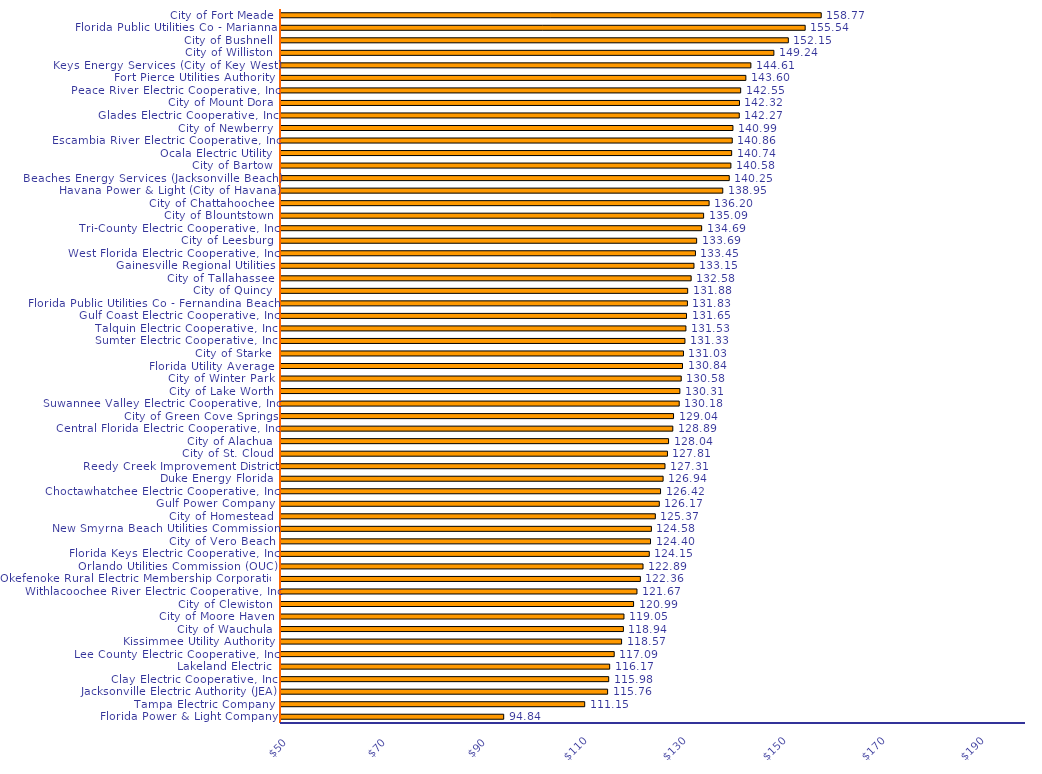
| Category | Series 0 | Series 1 | Series 2 | Series 3 | Series 4 | Series 5 | Series 6 | Series 7 | Series 8 | Series 9 | Series 10 | Series 11 | Series 12 |
|---|---|---|---|---|---|---|---|---|---|---|---|---|---|
| Florida Power & Light Company |  |  |  |  |  |  |  |  |  |  |  |  | 94.837 |
| Tampa Electric Company |  |  |  |  |  |  |  |  |  |  |  |  | 111.147 |
| Jacksonville Electric Authority (JEA) |  |  |  |  |  |  |  |  |  |  |  |  | 115.763 |
| Clay Electric Cooperative, Inc |  |  |  |  |  |  |  |  |  |  |  |  | 115.981 |
| Lakeland Electric |  |  |  |  |  |  |  |  |  |  |  |  | 116.174 |
| Lee County Electric Cooperative, Inc |  |  |  |  |  |  |  |  |  |  |  |  | 117.09 |
| Kissimmee Utility Authority |  |  |  |  |  |  |  |  |  |  |  |  | 118.573 |
| City of Wauchula |  |  |  |  |  |  |  |  |  |  |  |  | 118.94 |
| City of Moore Haven |  |  |  |  |  |  |  |  |  |  |  |  | 119.052 |
| City of Clewiston |  |  |  |  |  |  |  |  |  |  |  |  | 120.989 |
| Withlacoochee River Electric Cooperative, Inc |  |  |  |  |  |  |  |  |  |  |  |  | 121.67 |
| Okefenoke Rural Electric Membership Corporation |  |  |  |  |  |  |  |  |  |  |  |  | 122.36 |
| Orlando Utilities Commission (OUC) |  |  |  |  |  |  |  |  |  |  |  |  | 122.89 |
| Florida Keys Electric Cooperative, Inc |  |  |  |  |  |  |  |  |  |  |  |  | 124.152 |
| City of Vero Beach |  |  |  |  |  |  |  |  |  |  |  |  | 124.397 |
| New Smyrna Beach Utilities Commission |  |  |  |  |  |  |  |  |  |  |  |  | 124.578 |
| City of Homestead |  |  |  |  |  |  |  |  |  |  |  |  | 125.368 |
| Gulf Power Company |  |  |  |  |  |  |  |  |  |  |  |  | 126.17 |
| Choctawhatchee Electric Cooperative, Inc |  |  |  |  |  |  |  |  |  |  |  |  | 126.416 |
| Duke Energy Florida |  |  |  |  |  |  |  |  |  |  |  |  | 126.935 |
| Reedy Creek Improvement District |  |  |  |  |  |  |  |  |  |  |  |  | 127.312 |
| City of St. Cloud |  |  |  |  |  |  |  |  |  |  |  |  | 127.81 |
| City of Alachua |  |  |  |  |  |  |  |  |  |  |  |  | 128.035 |
| Central Florida Electric Cooperative, Inc |  |  |  |  |  |  |  |  |  |  |  |  | 128.887 |
| City of Green Cove Springs |  |  |  |  |  |  |  |  |  |  |  |  | 129.036 |
| Suwannee Valley Electric Cooperative, Inc |  |  |  |  |  |  |  |  |  |  |  |  | 130.177 |
| City of Lake Worth |  |  |  |  |  |  |  |  |  |  |  |  | 130.307 |
| City of Winter Park |  |  |  |  |  |  |  |  |  |  |  |  | 130.582 |
| Florida Utility Average |  |  |  |  |  |  |  |  |  |  |  |  | 130.842 |
| City of Starke |  |  |  |  |  |  |  |  |  |  |  |  | 131.032 |
| Sumter Electric Cooperative, Inc |  |  |  |  |  |  |  |  |  |  |  |  | 131.33 |
| Talquin Electric Cooperative, Inc |  |  |  |  |  |  |  |  |  |  |  |  | 131.525 |
| Gulf Coast Electric Cooperative, Inc |  |  |  |  |  |  |  |  |  |  |  |  | 131.65 |
| Florida Public Utilities Co - Fernandina Beach |  |  |  |  |  |  |  |  |  |  |  |  | 131.83 |
| City of Quincy |  |  |  |  |  |  |  |  |  |  |  |  | 131.881 |
| City of Tallahassee |  |  |  |  |  |  |  |  |  |  |  |  | 132.582 |
| Gainesville Regional Utilities |  |  |  |  |  |  |  |  |  |  |  |  | 133.15 |
| West Florida Electric Cooperative, Inc |  |  |  |  |  |  |  |  |  |  |  |  | 133.445 |
| City of Leesburg |  |  |  |  |  |  |  |  |  |  |  |  | 133.688 |
| Tri-County Electric Cooperative, Inc |  |  |  |  |  |  |  |  |  |  |  |  | 134.693 |
| City of Blountstown |  |  |  |  |  |  |  |  |  |  |  |  | 135.09 |
| City of Chattahoochee |  |  |  |  |  |  |  |  |  |  |  |  | 136.197 |
| Havana Power & Light (City of Havana) |  |  |  |  |  |  |  |  |  |  |  |  | 138.947 |
| Beaches Energy Services (Jacksonville Beach) |  |  |  |  |  |  |  |  |  |  |  |  | 140.252 |
| City of Bartow |  |  |  |  |  |  |  |  |  |  |  |  | 140.579 |
| Ocala Electric Utility |  |  |  |  |  |  |  |  |  |  |  |  | 140.738 |
| Escambia River Electric Cooperative, Inc |  |  |  |  |  |  |  |  |  |  |  |  | 140.856 |
| City of Newberry |  |  |  |  |  |  |  |  |  |  |  |  | 140.993 |
| Glades Electric Cooperative, Inc |  |  |  |  |  |  |  |  |  |  |  |  | 142.27 |
| City of Mount Dora |  |  |  |  |  |  |  |  |  |  |  |  | 142.315 |
| Peace River Electric Cooperative, Inc |  |  |  |  |  |  |  |  |  |  |  |  | 142.55 |
| Fort Pierce Utilities Authority |  |  |  |  |  |  |  |  |  |  |  |  | 143.598 |
| Keys Energy Services (City of Key West) |  |  |  |  |  |  |  |  |  |  |  |  | 144.605 |
| City of Williston |  |  |  |  |  |  |  |  |  |  |  |  | 149.237 |
| City of Bushnell |  |  |  |  |  |  |  |  |  |  |  |  | 152.146 |
| Florida Public Utilities Co - Marianna |  |  |  |  |  |  |  |  |  |  |  |  | 155.54 |
| City of Fort Meade |  |  |  |  |  |  |  |  |  |  |  |  | 158.771 |